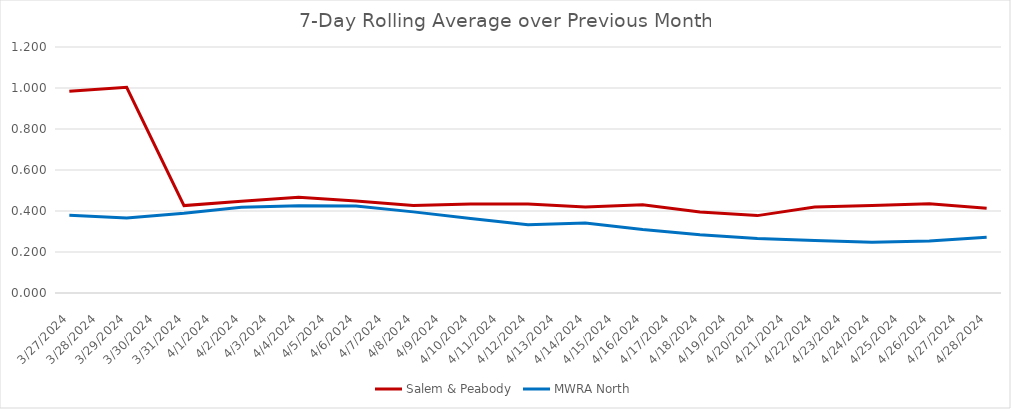
| Category | Salem & Peabody | MWRA North |
|---|---|---|
| 3/27/24 | 0.984 | 0.379 |
| 3/29/24 | 1.004 | 0.366 |
| 3/31/24 | 0.426 | 0.389 |
| 4/2/24 | 0.448 | 0.418 |
| 4/4/24 | 0.468 | 0.425 |
| 4/6/24 | 0.449 | 0.424 |
| 4/8/24 | 0.426 | 0.396 |
| 4/10/24 | 0.434 | 0.363 |
| 4/12/24 | 0.434 | 0.333 |
| 4/14/24 | 0.42 | 0.342 |
| 4/16/24 | 0.43 | 0.31 |
| 4/18/24 | 0.395 | 0.284 |
| 4/20/24 | 0.377 | 0.266 |
| 4/22/24 | 0.42 | 0.257 |
| 4/24/24 | 0.426 | 0.248 |
| 4/26/24 | 0.435 | 0.254 |
| 4/28/24 | 0.414 | 0.272 |